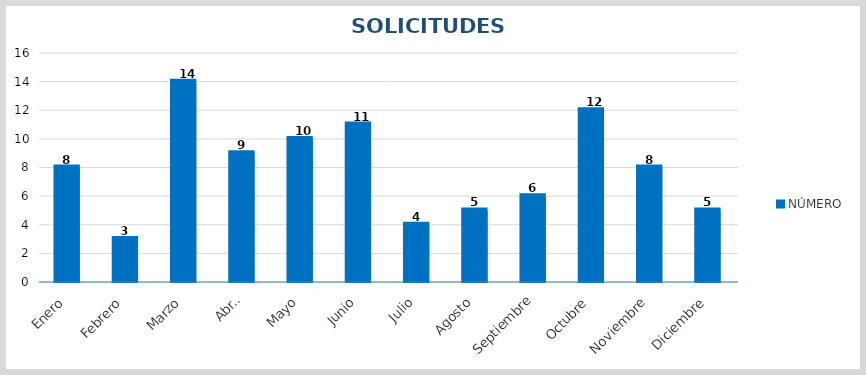
| Category | NÚMERO |
|---|---|
| Enero | 8 |
| Febrero | 3 |
| Marzo | 14 |
| Abril | 9 |
| Mayo | 10 |
| Junio | 11 |
| Julio | 4 |
| Agosto | 5 |
| Septiembre | 6 |
| Octubre | 12 |
| Noviembre | 8 |
| Diciembre | 5 |